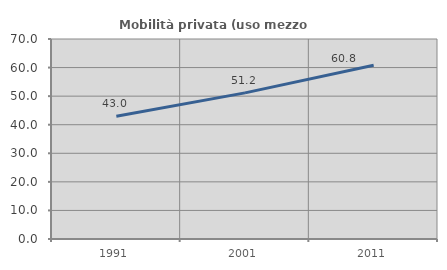
| Category | Mobilità privata (uso mezzo privato) |
|---|---|
| 1991.0 | 42.996 |
| 2001.0 | 51.15 |
| 2011.0 | 60.832 |